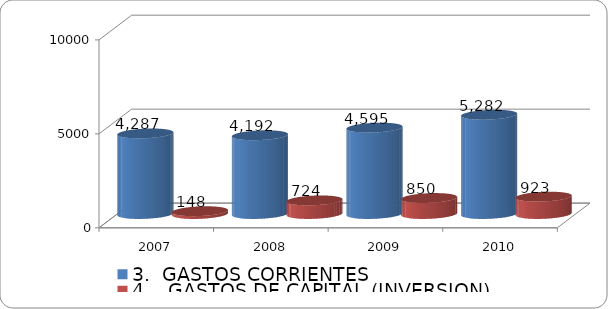
| Category | 3.  GASTOS CORRIENTES | 4.   GASTOS DE CAPITAL (INVERSION) |
|---|---|---|
| 2007 | 4287.389 | 148.37 |
| 2008 | 4191.507 | 723.881 |
| 2009 | 4595.293 | 849.737 |
| 2010 | 5282.228 | 922.683 |